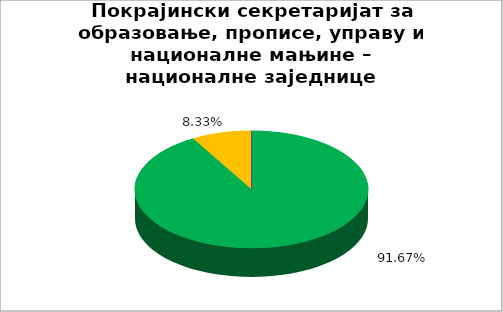
| Category | Покрајински секретаријат за образовање, прописе, управу и националне мањине – националне заједнице |
|---|---|
| 0 | 0.917 |
| 1 | 0.083 |
| 2 | 0 |
| 3 | 0 |
| 4 | 0 |